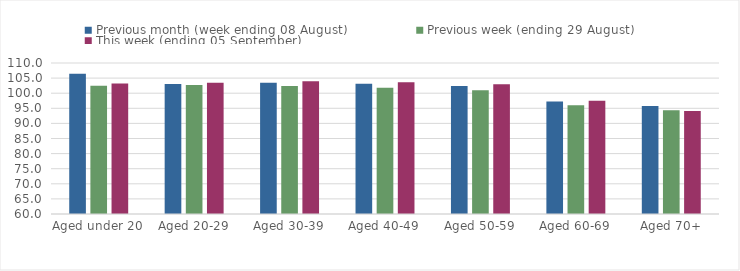
| Category | Previous month (week ending 08 August) | Previous week (ending 29 August) | This week (ending 05 September) |
|---|---|---|---|
| Aged under 20 | 106.46 | 102.47 | 103.22 |
| Aged 20-29 | 103.06 | 102.68 | 103.45 |
| Aged 30-39 | 103.42 | 102.42 | 103.93 |
| Aged 40-49 | 103.11 | 101.84 | 103.66 |
| Aged 50-59 | 102.38 | 100.96 | 103 |
| Aged 60-69 | 97.27 | 96.03 | 97.5 |
| Aged 70+ | 95.79 | 94.38 | 94.09 |